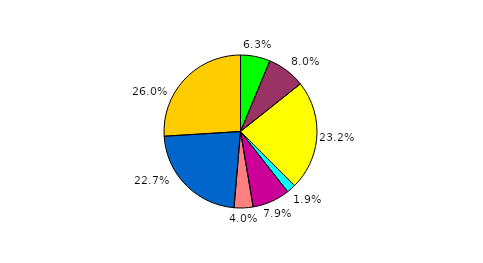
| Category | Series 0 |
|---|---|
| 0 | 6.274 |
| 1 | 8.033 |
| 2 | 23.188 |
| 3 | 1.929 |
| 4 | 7.927 |
| 5 | 4.006 |
| 6 | 22.658 |
| 7 | 25.986 |